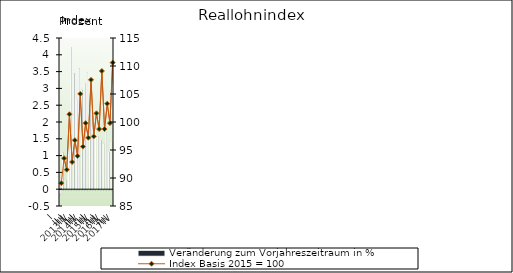
| Category | Veränderung zum Vorjahreszeitraum in % |
|---|---|
| 0 | -0.143 |
| 1 | 1.083 |
| 2 | 0.257 |
| 3 | 1.208 |
| 4 | 4.23 |
| 5 | 3.448 |
| 6 | 2.677 |
| 7 | 3.589 |
| 8 | 2.958 |
| 9 | 3.147 |
| 10 | 3.473 |
| 11 | 2.387 |
| 12 | 1.9 |
| 13 | 1.8 |
| 14 | 1.585 |
| 15 | 1.46 |
| 16 | 1.357 |
| 17 | 1.692 |
| 18 | 1.1 |
| 19 | 1.4 |